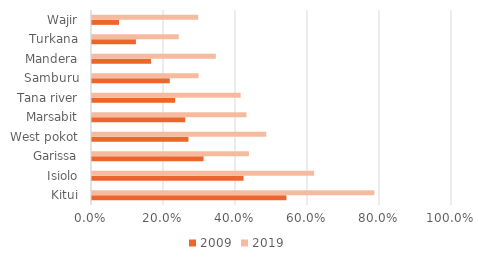
| Category | 2009 | 2019 |
|---|---|---|
| Kitui | 0.54 | 0.784 |
| Isiolo | 0.421 | 0.617 |
| Garissa | 0.31 | 0.436 |
| West pokot | 0.268 | 0.484 |
| Marsabit | 0.259 | 0.429 |
| Tana river | 0.231 | 0.413 |
| Samburu | 0.216 | 0.296 |
| Mandera | 0.164 | 0.344 |
| Turkana | 0.122 | 0.241 |
| Wajir | 0.075 | 0.295 |